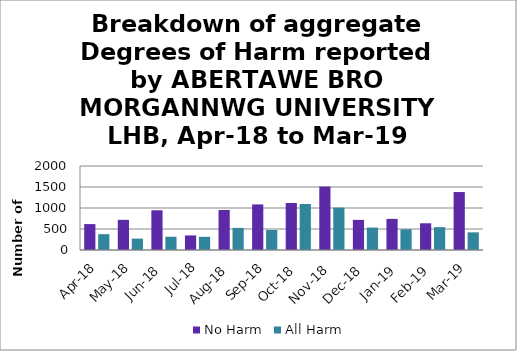
| Category | No Harm | All Harm |
|---|---|---|
| Apr-18 | 617 | 377 |
| May-18 | 718 | 271 |
| Jun-18 | 946 | 315 |
| Jul-18 | 347 | 314 |
| Aug-18 | 953 | 526 |
| Sep-18 | 1085 | 477 |
| Oct-18 | 1119 | 1095 |
| Nov-18 | 1510 | 1009 |
| Dec-18 | 717 | 534 |
| Jan-19 | 741 | 493 |
| Feb-19 | 636 | 544 |
| Mar-19 | 1380 | 420 |